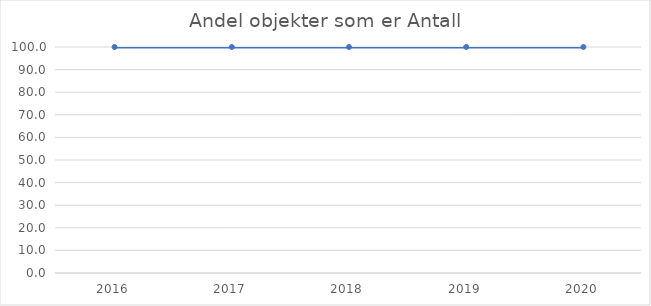
| Category | Andel objekter som er Antall |
|---|---|
| 2016.0 | 100 |
| 2017.0 | 100 |
| 2018.0 | 100 |
| 2019.0 | 100 |
| 2020.0 | 99.999 |